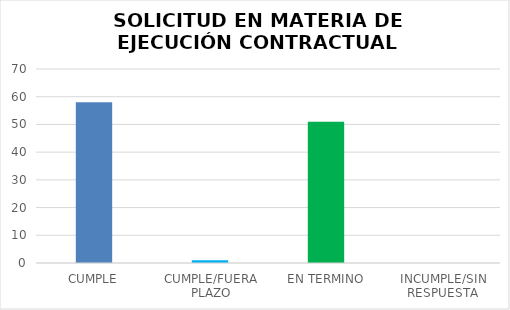
| Category | TOTAL |
|---|---|
| CUMPLE | 58 |
| CUMPLE/FUERA PLAZO | 1 |
| EN TERMINO | 51 |
| INCUMPLE/SIN RESPUESTA | 0 |